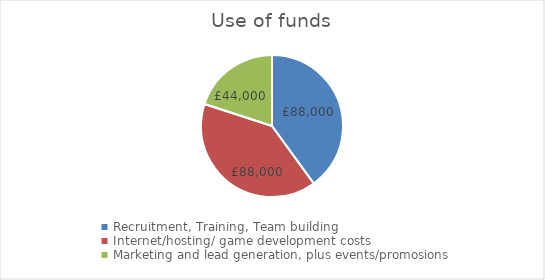
| Category | £ |
|---|---|
| Recruitment, Training, Team building | 88000 |
| Internet/hosting/ game development costs | 88000 |
| Marketing and lead generation, plus events/promosions | 44000 |